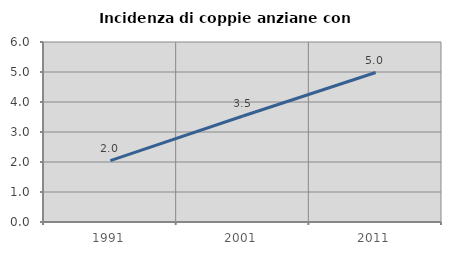
| Category | Incidenza di coppie anziane con figli |
|---|---|
| 1991.0 | 2.046 |
| 2001.0 | 3.533 |
| 2011.0 | 4.983 |